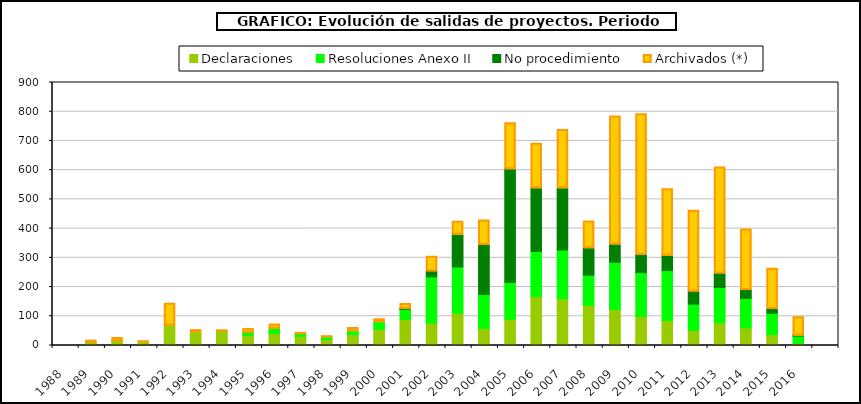
| Category | Declaraciones | Resoluciones Anexo II | No procedimiento | Archivados (*) |
|---|---|---|---|---|
| 1988.0 | 0 | 0 | 0 | 0 |
| 1989.0 | 7 | 0 | 0 | 8 |
| 1990.0 | 13 | 0 | 0 | 11 |
| 1991.0 | 9 | 0 | 0 | 4 |
| 1992.0 | 67 | 0 | 0 | 74 |
| 1993.0 | 44 | 0 | 0 | 7 |
| 1994.0 | 47 | 0 | 0 | 3 |
| 1995.0 | 31 | 10 | 0 | 14 |
| 1996.0 | 38 | 18 | 0 | 14 |
| 1997.0 | 28 | 10 | 0 | 2 |
| 1998.0 | 18 | 8 | 0 | 4 |
| 1999.0 | 34 | 13 | 0 | 11 |
| 2000.0 | 52 | 26 | 0 | 10 |
| 2001.0 | 86 | 35 | 2 | 17 |
| 2002.0 | 74 | 158 | 20 | 50 |
| 2003.0 | 108 | 158 | 111 | 45 |
| 2004.0 | 56 | 116 | 170 | 84 |
| 2005.0 | 87 | 126 | 388 | 158 |
| 2006.0 | 164 | 155 | 217 | 153 |
| 2007.0 | 157 | 167 | 212 | 200 |
| 2008.0 | 134 | 104 | 93 | 92 |
| 2009.0 | 120 | 162 | 62 | 438 |
| 2010.0 | 96 | 150 | 62 | 482 |
| 2011.0 | 82 | 171 | 52 | 228 |
| 2012.0 | 49 | 90 | 44 | 276 |
| 2013.0 | 75 | 120 | 50 | 362 |
| 2014.0 | 57 | 101 | 30 | 207 |
| 2015.0 | 34 | 74 | 15 | 138 |
| 2016.0 | 5 | 26 | 1 | 63 |